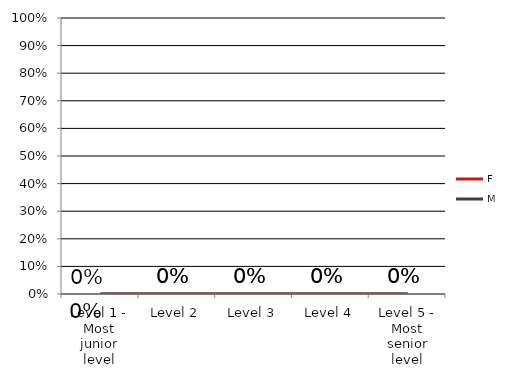
| Category | F | M |
|---|---|---|
| Level 1 - Most junior level | 0 | 0 |
| Level 2 | 0 | 0 |
| Level 3 | 0 | 0 |
| Level 4 | 0 | 0 |
| Level 5 - Most senior level | 0 | 0 |